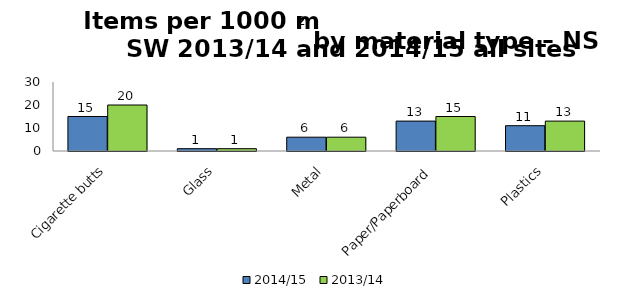
| Category | 2014/15 | 2013/14 |
|---|---|---|
| Cigarette butts | 15 | 20 |
| Glass | 1 | 1 |
| Metal | 6 | 6 |
| Paper/Paperboard | 13 | 15 |
| Plastics | 11 | 13 |